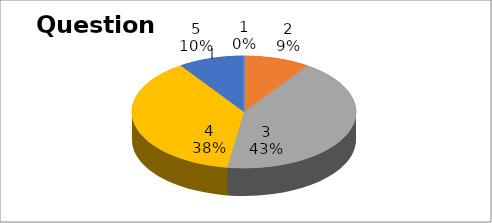
| Category | Series 0 |
|---|---|
| 0 | 0 |
| 1 | 2 |
| 2 | 9 |
| 3 | 8 |
| 4 | 2 |